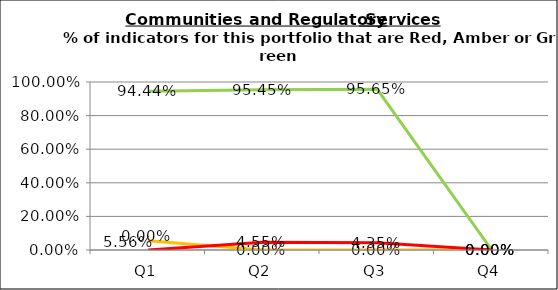
| Category | Green | Amber | Red |
|---|---|---|---|
| Q1 | 0.944 | 0.056 | 0 |
| Q2 | 0.955 | 0 | 0.045 |
| Q3 | 0.957 | 0 | 0.043 |
| Q4 | 0 | 0 | 0 |